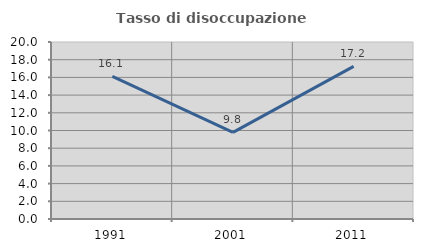
| Category | Tasso di disoccupazione giovanile  |
|---|---|
| 1991.0 | 16.11 |
| 2001.0 | 9.79 |
| 2011.0 | 17.241 |